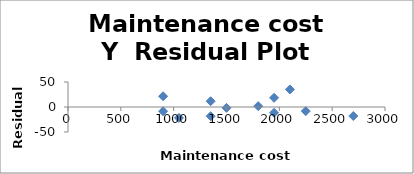
| Category | Series 0 |
|---|---|
| 1500.0 | -1.709 |
| 1950.0 | 18.418 |
| 900.0 | 21.456 |
| 900.0 | -8.544 |
| 2700.0 | -18.038 |
| 2250.0 | -8.165 |
| 1950.0 | -11.582 |
| 2100.0 | 35.127 |
| 1350.0 | 11.582 |
| 1050.0 | -21.835 |
| 1800.0 | 1.709 |
| 1350.0 | -18.418 |